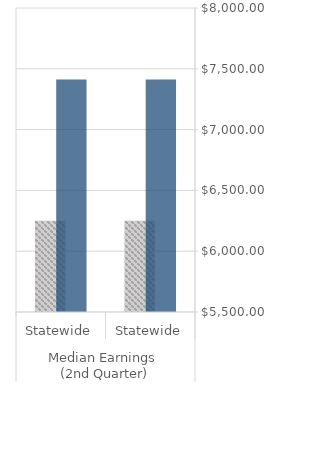
| Category | Negotiated | Actual |
|---|---|---|
| 0 | 6250 | 7411.2 |
| 1 | 6250 | 7411.2 |